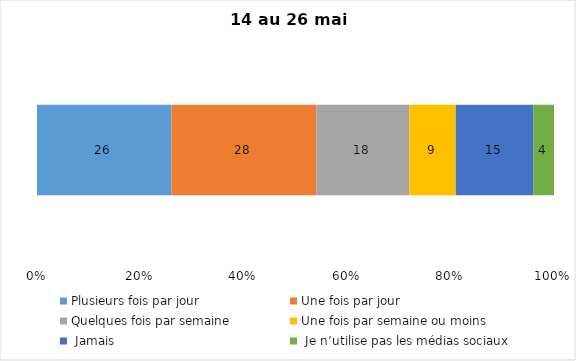
| Category | Plusieurs fois par jour | Une fois par jour | Quelques fois par semaine   | Une fois par semaine ou moins   |  Jamais   |  Je n’utilise pas les médias sociaux |
|---|---|---|---|---|---|---|
| 0 | 26 | 28 | 18 | 9 | 15 | 4 |